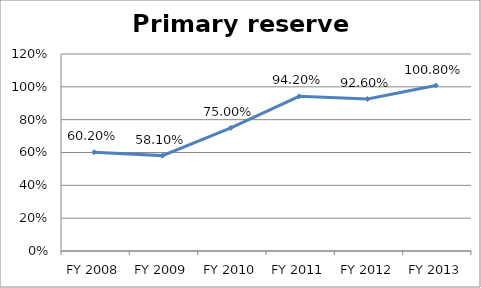
| Category | Primary reserve ratio |
|---|---|
| FY 2013 | 1.008 |
| FY 2012 | 0.926 |
| FY 2011 | 0.942 |
| FY 2010 | 0.75 |
| FY 2009 | 0.581 |
| FY 2008 | 0.602 |